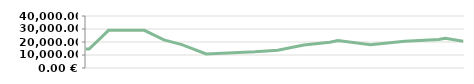
| Category | MÊS   |
|---|---|
| 2013-04-23 | 14600 |
| 2013-04-25 | 14600 |
| 2013-05-07 | 29000 |
| 2013-05-14 | 29000 |
| 2013-05-14 | 29000 |
| 2013-05-29 | 29000 |
| 2013-06-10 | 21600 |
| 2013-06-21 | 17950 |
| 2013-07-06 | 10776.471 |
| 2013-08-05 | 12455.862 |
| 2013-08-19 | 13667.568 |
| 2013-09-04 | 17651.667 |
| 2013-09-20 | 19877.912 |
| 2013-09-25 | 21138.05 |
| 2013-10-15 | 17951.744 |
| 2013-11-05 | 20556.13 |
| 2013-11-26 | 21997.139 |
| 2013-11-30 | 22917.635 |
| 2013-12-11 | 20504.315 |